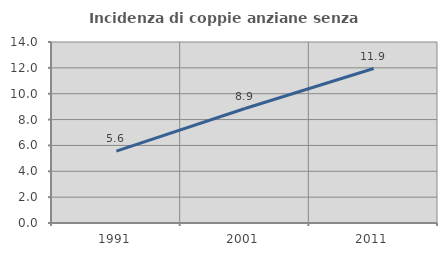
| Category | Incidenza di coppie anziane senza figli  |
|---|---|
| 1991.0 | 5.557 |
| 2001.0 | 8.853 |
| 2011.0 | 11.947 |